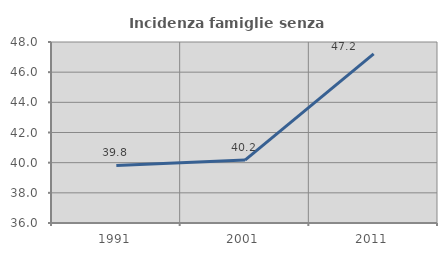
| Category | Incidenza famiglie senza nuclei |
|---|---|
| 1991.0 | 39.818 |
| 2001.0 | 40.173 |
| 2011.0 | 47.215 |